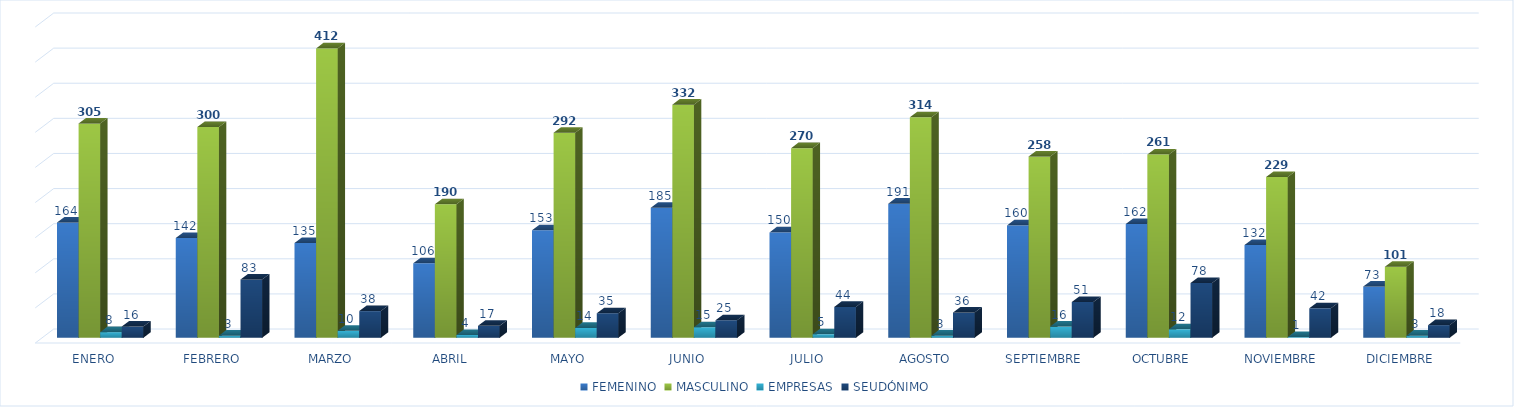
| Category | FEMENINO | MASCULINO | EMPRESAS | SEUDÓNIMO |
|---|---|---|---|---|
| ENERO | 164 | 305 | 8 | 16 |
| FEBRERO | 142 | 300 | 3 | 83 |
| MARZO | 135 | 412 | 10 | 38 |
| ABRIL | 106 | 190 | 4 | 17 |
| MAYO | 153 | 292 | 14 | 35 |
| JUNIO | 185 | 332 | 15 | 25 |
| JULIO | 150 | 270 | 5 | 44 |
| AGOSTO | 191 | 314 | 3 | 36 |
| SEPTIEMBRE | 160 | 258 | 16 | 51 |
| OCTUBRE | 162 | 261 | 12 | 78 |
| NOVIEMBRE | 132 | 229 | 1 | 42 |
| DICIEMBRE | 73 | 101 | 3 | 18 |